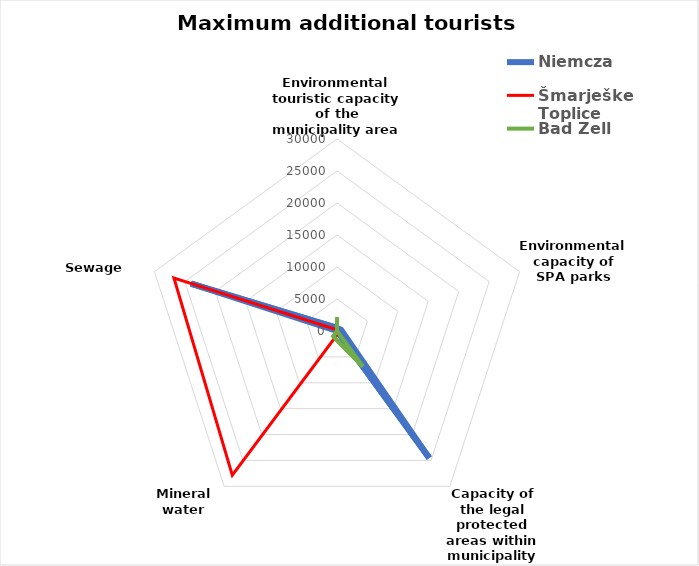
| Category | Niemcza | Šmarješke Toplice | Bad Zell |
|---|---|---|---|
| Environmental touristic capacity of the municipality area | 478 | -202 | 2163 |
| Environmental capacity of SPA parks | 655 | 107 | 0 |
| Capacity of the legal protected areas within municipality borders | 24515 | -386 | 6862 |
| Mineral water quantity | 0 | 27830 | 1019 |
| Sewage quantity | 23980 | 26790 | 0 |